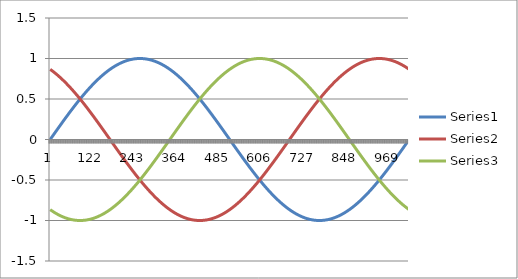
| Category | Series 0 | Series 1 | Series 2 |
|---|---|---|---|
| 0 | 0 | 0.866 | -0.866 |
| 1 | 0.006 | 0.863 | -0.869 |
| 2 | 0.012 | 0.86 | -0.872 |
| 3 | 0.018 | 0.857 | -0.875 |
| 4 | 0.025 | 0.853 | -0.878 |
| 5 | 0.031 | 0.85 | -0.881 |
| 6 | 0.037 | 0.847 | -0.884 |
| 7 | 0.043 | 0.844 | -0.887 |
| 8 | 0.049 | 0.84 | -0.889 |
| 9 | 0.055 | 0.837 | -0.892 |
| 10 | 0.061 | 0.834 | -0.895 |
| 11 | 0.067 | 0.83 | -0.898 |
| 12 | 0.074 | 0.827 | -0.9 |
| 13 | 0.08 | 0.823 | -0.903 |
| 14 | 0.086 | 0.82 | -0.906 |
| 15 | 0.092 | 0.816 | -0.908 |
| 16 | 0.098 | 0.813 | -0.911 |
| 17 | 0.104 | 0.809 | -0.913 |
| 18 | 0.11 | 0.806 | -0.916 |
| 19 | 0.116 | 0.802 | -0.918 |
| 20 | 0.122 | 0.798 | -0.921 |
| 21 | 0.128 | 0.795 | -0.923 |
| 22 | 0.135 | 0.791 | -0.925 |
| 23 | 0.141 | 0.787 | -0.928 |
| 24 | 0.147 | 0.783 | -0.93 |
| 25 | 0.153 | 0.779 | -0.932 |
| 26 | 0.159 | 0.776 | -0.934 |
| 27 | 0.165 | 0.772 | -0.937 |
| 28 | 0.171 | 0.768 | -0.939 |
| 29 | 0.177 | 0.764 | -0.941 |
| 30 | 0.183 | 0.76 | -0.943 |
| 31 | 0.189 | 0.756 | -0.945 |
| 32 | 0.195 | 0.752 | -0.947 |
| 33 | 0.201 | 0.748 | -0.949 |
| 34 | 0.207 | 0.744 | -0.951 |
| 35 | 0.213 | 0.74 | -0.953 |
| 36 | 0.219 | 0.735 | -0.955 |
| 37 | 0.225 | 0.731 | -0.956 |
| 38 | 0.231 | 0.727 | -0.958 |
| 39 | 0.237 | 0.723 | -0.96 |
| 40 | 0.243 | 0.719 | -0.962 |
| 41 | 0.249 | 0.714 | -0.963 |
| 42 | 0.255 | 0.71 | -0.965 |
| 43 | 0.261 | 0.706 | -0.966 |
| 44 | 0.267 | 0.701 | -0.968 |
| 45 | 0.273 | 0.697 | -0.97 |
| 46 | 0.279 | 0.692 | -0.971 |
| 47 | 0.284 | 0.688 | -0.972 |
| 48 | 0.29 | 0.684 | -0.974 |
| 49 | 0.296 | 0.679 | -0.975 |
| 50 | 0.302 | 0.675 | -0.977 |
| 51 | 0.308 | 0.67 | -0.978 |
| 52 | 0.314 | 0.665 | -0.979 |
| 53 | 0.319 | 0.661 | -0.98 |
| 54 | 0.325 | 0.656 | -0.982 |
| 55 | 0.331 | 0.652 | -0.983 |
| 56 | 0.337 | 0.647 | -0.984 |
| 57 | 0.343 | 0.642 | -0.985 |
| 58 | 0.348 | 0.638 | -0.986 |
| 59 | 0.354 | 0.633 | -0.987 |
| 60 | 0.36 | 0.628 | -0.988 |
| 61 | 0.366 | 0.623 | -0.989 |
| 62 | 0.371 | 0.618 | -0.99 |
| 63 | 0.377 | 0.614 | -0.991 |
| 64 | 0.383 | 0.609 | -0.991 |
| 65 | 0.388 | 0.604 | -0.992 |
| 66 | 0.394 | 0.599 | -0.993 |
| 67 | 0.4 | 0.594 | -0.994 |
| 68 | 0.405 | 0.589 | -0.994 |
| 69 | 0.411 | 0.584 | -0.995 |
| 70 | 0.416 | 0.579 | -0.996 |
| 71 | 0.422 | 0.574 | -0.996 |
| 72 | 0.428 | 0.569 | -0.997 |
| 73 | 0.433 | 0.564 | -0.997 |
| 74 | 0.439 | 0.559 | -0.998 |
| 75 | 0.444 | 0.554 | -0.998 |
| 76 | 0.45 | 0.549 | -0.998 |
| 77 | 0.455 | 0.544 | -0.999 |
| 78 | 0.461 | 0.538 | -0.999 |
| 79 | 0.466 | 0.533 | -0.999 |
| 80 | 0.471 | 0.528 | -0.999 |
| 81 | 0.477 | 0.523 | -1 |
| 82 | 0.482 | 0.518 | -1 |
| 83 | 0.488 | 0.512 | -1 |
| 84 | 0.493 | 0.507 | -1 |
| 85 | 0.498 | 0.502 | -1 |
| 86 | 0.504 | 0.496 | -1 |
| 87 | 0.509 | 0.491 | -1 |
| 88 | 0.514 | 0.486 | -1 |
| 89 | 0.519 | 0.48 | -1 |
| 90 | 0.525 | 0.475 | -1 |
| 91 | 0.53 | 0.47 | -0.999 |
| 92 | 0.535 | 0.464 | -0.999 |
| 93 | 0.54 | 0.459 | -0.999 |
| 94 | 0.545 | 0.453 | -0.999 |
| 95 | 0.55 | 0.448 | -0.998 |
| 96 | 0.556 | 0.442 | -0.998 |
| 97 | 0.561 | 0.437 | -0.997 |
| 98 | 0.566 | 0.431 | -0.997 |
| 99 | 0.571 | 0.426 | -0.996 |
| 100 | 0.576 | 0.42 | -0.996 |
| 101 | 0.581 | 0.415 | -0.995 |
| 102 | 0.586 | 0.409 | -0.995 |
| 103 | 0.591 | 0.403 | -0.994 |
| 104 | 0.596 | 0.398 | -0.993 |
| 105 | 0.601 | 0.392 | -0.993 |
| 106 | 0.605 | 0.386 | -0.992 |
| 107 | 0.61 | 0.381 | -0.991 |
| 108 | 0.615 | 0.375 | -0.99 |
| 109 | 0.62 | 0.369 | -0.989 |
| 110 | 0.625 | 0.364 | -0.989 |
| 111 | 0.63 | 0.358 | -0.988 |
| 112 | 0.634 | 0.352 | -0.987 |
| 113 | 0.639 | 0.346 | -0.986 |
| 114 | 0.644 | 0.341 | -0.985 |
| 115 | 0.648 | 0.335 | -0.983 |
| 116 | 0.653 | 0.329 | -0.982 |
| 117 | 0.658 | 0.323 | -0.981 |
| 118 | 0.662 | 0.318 | -0.98 |
| 119 | 0.667 | 0.312 | -0.979 |
| 120 | 0.672 | 0.306 | -0.977 |
| 121 | 0.676 | 0.3 | -0.976 |
| 122 | 0.681 | 0.294 | -0.975 |
| 123 | 0.685 | 0.288 | -0.973 |
| 124 | 0.69 | 0.282 | -0.972 |
| 125 | 0.694 | 0.277 | -0.97 |
| 126 | 0.698 | 0.271 | -0.969 |
| 127 | 0.703 | 0.265 | -0.967 |
| 128 | 0.707 | 0.259 | -0.966 |
| 129 | 0.711 | 0.253 | -0.964 |
| 130 | 0.716 | 0.247 | -0.963 |
| 131 | 0.72 | 0.241 | -0.961 |
| 132 | 0.724 | 0.235 | -0.959 |
| 133 | 0.728 | 0.229 | -0.958 |
| 134 | 0.733 | 0.223 | -0.956 |
| 135 | 0.737 | 0.217 | -0.954 |
| 136 | 0.741 | 0.211 | -0.952 |
| 137 | 0.745 | 0.205 | -0.95 |
| 138 | 0.749 | 0.199 | -0.948 |
| 139 | 0.753 | 0.193 | -0.946 |
| 140 | 0.757 | 0.187 | -0.944 |
| 141 | 0.761 | 0.181 | -0.942 |
| 142 | 0.765 | 0.175 | -0.94 |
| 143 | 0.769 | 0.169 | -0.938 |
| 144 | 0.773 | 0.163 | -0.936 |
| 145 | 0.777 | 0.157 | -0.934 |
| 146 | 0.781 | 0.151 | -0.931 |
| 147 | 0.785 | 0.145 | -0.929 |
| 148 | 0.788 | 0.139 | -0.927 |
| 149 | 0.792 | 0.133 | -0.925 |
| 150 | 0.796 | 0.126 | -0.922 |
| 151 | 0.8 | 0.12 | -0.92 |
| 152 | 0.803 | 0.114 | -0.917 |
| 153 | 0.807 | 0.108 | -0.915 |
| 154 | 0.81 | 0.102 | -0.913 |
| 155 | 0.814 | 0.096 | -0.91 |
| 156 | 0.818 | 0.09 | -0.907 |
| 157 | 0.821 | 0.084 | -0.905 |
| 158 | 0.825 | 0.078 | -0.902 |
| 159 | 0.828 | 0.072 | -0.9 |
| 160 | 0.831 | 0.065 | -0.897 |
| 161 | 0.835 | 0.059 | -0.894 |
| 162 | 0.838 | 0.053 | -0.891 |
| 163 | 0.842 | 0.047 | -0.889 |
| 164 | 0.845 | 0.041 | -0.886 |
| 165 | 0.848 | 0.035 | -0.883 |
| 166 | 0.851 | 0.029 | -0.88 |
| 167 | 0.855 | 0.022 | -0.877 |
| 168 | 0.858 | 0.016 | -0.874 |
| 169 | 0.861 | 0.01 | -0.871 |
| 170 | 0.864 | 0.004 | -0.868 |
| 171 | 0.867 | -0.002 | -0.865 |
| 172 | 0.87 | -0.008 | -0.862 |
| 173 | 0.873 | -0.014 | -0.859 |
| 174 | 0.876 | -0.02 | -0.856 |
| 175 | 0.879 | -0.027 | -0.852 |
| 176 | 0.882 | -0.033 | -0.849 |
| 177 | 0.885 | -0.039 | -0.846 |
| 178 | 0.888 | -0.045 | -0.843 |
| 179 | 0.89 | -0.051 | -0.839 |
| 180 | 0.893 | -0.057 | -0.836 |
| 181 | 0.896 | -0.063 | -0.833 |
| 182 | 0.899 | -0.069 | -0.829 |
| 183 | 0.901 | -0.076 | -0.826 |
| 184 | 0.904 | -0.082 | -0.822 |
| 185 | 0.907 | -0.088 | -0.819 |
| 186 | 0.909 | -0.094 | -0.815 |
| 187 | 0.912 | -0.1 | -0.812 |
| 188 | 0.914 | -0.106 | -0.808 |
| 189 | 0.917 | -0.112 | -0.804 |
| 190 | 0.919 | -0.118 | -0.801 |
| 191 | 0.921 | -0.124 | -0.797 |
| 192 | 0.924 | -0.131 | -0.793 |
| 193 | 0.926 | -0.137 | -0.79 |
| 194 | 0.928 | -0.143 | -0.786 |
| 195 | 0.931 | -0.149 | -0.782 |
| 196 | 0.933 | -0.155 | -0.778 |
| 197 | 0.935 | -0.161 | -0.774 |
| 198 | 0.937 | -0.167 | -0.77 |
| 199 | 0.939 | -0.173 | -0.766 |
| 200 | 0.942 | -0.179 | -0.763 |
| 201 | 0.944 | -0.185 | -0.759 |
| 202 | 0.946 | -0.191 | -0.755 |
| 203 | 0.948 | -0.197 | -0.75 |
| 204 | 0.95 | -0.203 | -0.746 |
| 205 | 0.951 | -0.209 | -0.742 |
| 206 | 0.953 | -0.215 | -0.738 |
| 207 | 0.955 | -0.221 | -0.734 |
| 208 | 0.957 | -0.227 | -0.73 |
| 209 | 0.959 | -0.233 | -0.726 |
| 210 | 0.96 | -0.239 | -0.721 |
| 211 | 0.962 | -0.245 | -0.717 |
| 212 | 0.964 | -0.251 | -0.713 |
| 213 | 0.965 | -0.257 | -0.709 |
| 214 | 0.967 | -0.263 | -0.704 |
| 215 | 0.968 | -0.269 | -0.7 |
| 216 | 0.97 | -0.275 | -0.695 |
| 217 | 0.971 | -0.28 | -0.691 |
| 218 | 0.973 | -0.286 | -0.687 |
| 219 | 0.974 | -0.292 | -0.682 |
| 220 | 0.976 | -0.298 | -0.678 |
| 221 | 0.977 | -0.304 | -0.673 |
| 222 | 0.978 | -0.31 | -0.669 |
| 223 | 0.98 | -0.316 | -0.664 |
| 224 | 0.981 | -0.321 | -0.659 |
| 225 | 0.982 | -0.327 | -0.655 |
| 226 | 0.983 | -0.333 | -0.65 |
| 227 | 0.984 | -0.339 | -0.645 |
| 228 | 0.985 | -0.345 | -0.641 |
| 229 | 0.986 | -0.35 | -0.636 |
| 230 | 0.987 | -0.356 | -0.631 |
| 231 | 0.988 | -0.362 | -0.626 |
| 232 | 0.989 | -0.368 | -0.622 |
| 233 | 0.99 | -0.373 | -0.617 |
| 234 | 0.991 | -0.379 | -0.612 |
| 235 | 0.992 | -0.385 | -0.607 |
| 236 | 0.992 | -0.39 | -0.602 |
| 237 | 0.993 | -0.396 | -0.597 |
| 238 | 0.994 | -0.401 | -0.592 |
| 239 | 0.995 | -0.407 | -0.587 |
| 240 | 0.995 | -0.413 | -0.582 |
| 241 | 0.996 | -0.418 | -0.577 |
| 242 | 0.996 | -0.424 | -0.572 |
| 243 | 0.997 | -0.429 | -0.567 |
| 244 | 0.997 | -0.435 | -0.562 |
| 245 | 0.998 | -0.44 | -0.557 |
| 246 | 0.998 | -0.446 | -0.552 |
| 247 | 0.998 | -0.451 | -0.547 |
| 248 | 0.999 | -0.457 | -0.542 |
| 249 | 0.999 | -0.462 | -0.537 |
| 250 | 0.999 | -0.468 | -0.532 |
| 251 | 1 | -0.473 | -0.526 |
| 252 | 1 | -0.479 | -0.521 |
| 253 | 1 | -0.484 | -0.516 |
| 254 | 1 | -0.489 | -0.511 |
| 255 | 1 | -0.495 | -0.505 |
| 256 | 1 | -0.5 | -0.5 |
| 257 | 1 | -0.505 | -0.495 |
| 258 | 1 | -0.511 | -0.489 |
| 259 | 1 | -0.516 | -0.484 |
| 260 | 1 | -0.521 | -0.479 |
| 261 | 1 | -0.526 | -0.473 |
| 262 | 0.999 | -0.532 | -0.468 |
| 263 | 0.999 | -0.537 | -0.462 |
| 264 | 0.999 | -0.542 | -0.457 |
| 265 | 0.998 | -0.547 | -0.451 |
| 266 | 0.998 | -0.552 | -0.446 |
| 267 | 0.998 | -0.557 | -0.44 |
| 268 | 0.997 | -0.562 | -0.435 |
| 269 | 0.997 | -0.567 | -0.429 |
| 270 | 0.996 | -0.572 | -0.424 |
| 271 | 0.996 | -0.577 | -0.418 |
| 272 | 0.995 | -0.582 | -0.413 |
| 273 | 0.995 | -0.587 | -0.407 |
| 274 | 0.994 | -0.592 | -0.401 |
| 275 | 0.993 | -0.597 | -0.396 |
| 276 | 0.992 | -0.602 | -0.39 |
| 277 | 0.992 | -0.607 | -0.385 |
| 278 | 0.991 | -0.612 | -0.379 |
| 279 | 0.99 | -0.617 | -0.373 |
| 280 | 0.989 | -0.622 | -0.368 |
| 281 | 0.988 | -0.626 | -0.362 |
| 282 | 0.987 | -0.631 | -0.356 |
| 283 | 0.986 | -0.636 | -0.35 |
| 284 | 0.985 | -0.641 | -0.345 |
| 285 | 0.984 | -0.645 | -0.339 |
| 286 | 0.983 | -0.65 | -0.333 |
| 287 | 0.982 | -0.655 | -0.327 |
| 288 | 0.981 | -0.659 | -0.321 |
| 289 | 0.98 | -0.664 | -0.316 |
| 290 | 0.978 | -0.669 | -0.31 |
| 291 | 0.977 | -0.673 | -0.304 |
| 292 | 0.976 | -0.678 | -0.298 |
| 293 | 0.974 | -0.682 | -0.292 |
| 294 | 0.973 | -0.687 | -0.286 |
| 295 | 0.971 | -0.691 | -0.28 |
| 296 | 0.97 | -0.695 | -0.275 |
| 297 | 0.968 | -0.7 | -0.269 |
| 298 | 0.967 | -0.704 | -0.263 |
| 299 | 0.965 | -0.709 | -0.257 |
| 300 | 0.964 | -0.713 | -0.251 |
| 301 | 0.962 | -0.717 | -0.245 |
| 302 | 0.96 | -0.721 | -0.239 |
| 303 | 0.959 | -0.726 | -0.233 |
| 304 | 0.957 | -0.73 | -0.227 |
| 305 | 0.955 | -0.734 | -0.221 |
| 306 | 0.953 | -0.738 | -0.215 |
| 307 | 0.951 | -0.742 | -0.209 |
| 308 | 0.95 | -0.746 | -0.203 |
| 309 | 0.948 | -0.75 | -0.197 |
| 310 | 0.946 | -0.755 | -0.191 |
| 311 | 0.944 | -0.759 | -0.185 |
| 312 | 0.942 | -0.763 | -0.179 |
| 313 | 0.939 | -0.766 | -0.173 |
| 314 | 0.937 | -0.77 | -0.167 |
| 315 | 0.935 | -0.774 | -0.161 |
| 316 | 0.933 | -0.778 | -0.155 |
| 317 | 0.931 | -0.782 | -0.149 |
| 318 | 0.928 | -0.786 | -0.143 |
| 319 | 0.926 | -0.79 | -0.137 |
| 320 | 0.924 | -0.793 | -0.131 |
| 321 | 0.921 | -0.797 | -0.124 |
| 322 | 0.919 | -0.801 | -0.118 |
| 323 | 0.917 | -0.804 | -0.112 |
| 324 | 0.914 | -0.808 | -0.106 |
| 325 | 0.912 | -0.812 | -0.1 |
| 326 | 0.909 | -0.815 | -0.094 |
| 327 | 0.907 | -0.819 | -0.088 |
| 328 | 0.904 | -0.822 | -0.082 |
| 329 | 0.901 | -0.826 | -0.076 |
| 330 | 0.899 | -0.829 | -0.069 |
| 331 | 0.896 | -0.833 | -0.063 |
| 332 | 0.893 | -0.836 | -0.057 |
| 333 | 0.89 | -0.839 | -0.051 |
| 334 | 0.888 | -0.843 | -0.045 |
| 335 | 0.885 | -0.846 | -0.039 |
| 336 | 0.882 | -0.849 | -0.033 |
| 337 | 0.879 | -0.852 | -0.027 |
| 338 | 0.876 | -0.856 | -0.02 |
| 339 | 0.873 | -0.859 | -0.014 |
| 340 | 0.87 | -0.862 | -0.008 |
| 341 | 0.867 | -0.865 | -0.002 |
| 342 | 0.864 | -0.868 | 0.004 |
| 343 | 0.861 | -0.871 | 0.01 |
| 344 | 0.858 | -0.874 | 0.016 |
| 345 | 0.855 | -0.877 | 0.022 |
| 346 | 0.851 | -0.88 | 0.029 |
| 347 | 0.848 | -0.883 | 0.035 |
| 348 | 0.845 | -0.886 | 0.041 |
| 349 | 0.842 | -0.889 | 0.047 |
| 350 | 0.838 | -0.891 | 0.053 |
| 351 | 0.835 | -0.894 | 0.059 |
| 352 | 0.831 | -0.897 | 0.065 |
| 353 | 0.828 | -0.9 | 0.072 |
| 354 | 0.825 | -0.902 | 0.078 |
| 355 | 0.821 | -0.905 | 0.084 |
| 356 | 0.818 | -0.907 | 0.09 |
| 357 | 0.814 | -0.91 | 0.096 |
| 358 | 0.81 | -0.913 | 0.102 |
| 359 | 0.807 | -0.915 | 0.108 |
| 360 | 0.803 | -0.917 | 0.114 |
| 361 | 0.8 | -0.92 | 0.12 |
| 362 | 0.796 | -0.922 | 0.126 |
| 363 | 0.792 | -0.925 | 0.133 |
| 364 | 0.788 | -0.927 | 0.139 |
| 365 | 0.785 | -0.929 | 0.145 |
| 366 | 0.781 | -0.931 | 0.151 |
| 367 | 0.777 | -0.934 | 0.157 |
| 368 | 0.773 | -0.936 | 0.163 |
| 369 | 0.769 | -0.938 | 0.169 |
| 370 | 0.765 | -0.94 | 0.175 |
| 371 | 0.761 | -0.942 | 0.181 |
| 372 | 0.757 | -0.944 | 0.187 |
| 373 | 0.753 | -0.946 | 0.193 |
| 374 | 0.749 | -0.948 | 0.199 |
| 375 | 0.745 | -0.95 | 0.205 |
| 376 | 0.741 | -0.952 | 0.211 |
| 377 | 0.737 | -0.954 | 0.217 |
| 378 | 0.733 | -0.956 | 0.223 |
| 379 | 0.728 | -0.958 | 0.229 |
| 380 | 0.724 | -0.959 | 0.235 |
| 381 | 0.72 | -0.961 | 0.241 |
| 382 | 0.716 | -0.963 | 0.247 |
| 383 | 0.711 | -0.964 | 0.253 |
| 384 | 0.707 | -0.966 | 0.259 |
| 385 | 0.703 | -0.967 | 0.265 |
| 386 | 0.698 | -0.969 | 0.271 |
| 387 | 0.694 | -0.97 | 0.277 |
| 388 | 0.69 | -0.972 | 0.282 |
| 389 | 0.685 | -0.973 | 0.288 |
| 390 | 0.681 | -0.975 | 0.294 |
| 391 | 0.676 | -0.976 | 0.3 |
| 392 | 0.672 | -0.977 | 0.306 |
| 393 | 0.667 | -0.979 | 0.312 |
| 394 | 0.662 | -0.98 | 0.318 |
| 395 | 0.658 | -0.981 | 0.323 |
| 396 | 0.653 | -0.982 | 0.329 |
| 397 | 0.648 | -0.983 | 0.335 |
| 398 | 0.644 | -0.985 | 0.341 |
| 399 | 0.639 | -0.986 | 0.346 |
| 400 | 0.634 | -0.987 | 0.352 |
| 401 | 0.63 | -0.988 | 0.358 |
| 402 | 0.625 | -0.989 | 0.364 |
| 403 | 0.62 | -0.989 | 0.369 |
| 404 | 0.615 | -0.99 | 0.375 |
| 405 | 0.61 | -0.991 | 0.381 |
| 406 | 0.605 | -0.992 | 0.386 |
| 407 | 0.601 | -0.993 | 0.392 |
| 408 | 0.596 | -0.993 | 0.398 |
| 409 | 0.591 | -0.994 | 0.403 |
| 410 | 0.586 | -0.995 | 0.409 |
| 411 | 0.581 | -0.995 | 0.415 |
| 412 | 0.576 | -0.996 | 0.42 |
| 413 | 0.571 | -0.996 | 0.426 |
| 414 | 0.566 | -0.997 | 0.431 |
| 415 | 0.561 | -0.997 | 0.437 |
| 416 | 0.556 | -0.998 | 0.442 |
| 417 | 0.55 | -0.998 | 0.448 |
| 418 | 0.545 | -0.999 | 0.453 |
| 419 | 0.54 | -0.999 | 0.459 |
| 420 | 0.535 | -0.999 | 0.464 |
| 421 | 0.53 | -0.999 | 0.47 |
| 422 | 0.525 | -1 | 0.475 |
| 423 | 0.519 | -1 | 0.48 |
| 424 | 0.514 | -1 | 0.486 |
| 425 | 0.509 | -1 | 0.491 |
| 426 | 0.504 | -1 | 0.496 |
| 427 | 0.498 | -1 | 0.502 |
| 428 | 0.493 | -1 | 0.507 |
| 429 | 0.488 | -1 | 0.512 |
| 430 | 0.482 | -1 | 0.518 |
| 431 | 0.477 | -1 | 0.523 |
| 432 | 0.471 | -0.999 | 0.528 |
| 433 | 0.466 | -0.999 | 0.533 |
| 434 | 0.461 | -0.999 | 0.538 |
| 435 | 0.455 | -0.999 | 0.544 |
| 436 | 0.45 | -0.998 | 0.549 |
| 437 | 0.444 | -0.998 | 0.554 |
| 438 | 0.439 | -0.998 | 0.559 |
| 439 | 0.433 | -0.997 | 0.564 |
| 440 | 0.428 | -0.997 | 0.569 |
| 441 | 0.422 | -0.996 | 0.574 |
| 442 | 0.416 | -0.996 | 0.579 |
| 443 | 0.411 | -0.995 | 0.584 |
| 444 | 0.405 | -0.994 | 0.589 |
| 445 | 0.4 | -0.994 | 0.594 |
| 446 | 0.394 | -0.993 | 0.599 |
| 447 | 0.388 | -0.992 | 0.604 |
| 448 | 0.383 | -0.991 | 0.609 |
| 449 | 0.377 | -0.991 | 0.614 |
| 450 | 0.371 | -0.99 | 0.618 |
| 451 | 0.366 | -0.989 | 0.623 |
| 452 | 0.36 | -0.988 | 0.628 |
| 453 | 0.354 | -0.987 | 0.633 |
| 454 | 0.348 | -0.986 | 0.638 |
| 455 | 0.343 | -0.985 | 0.642 |
| 456 | 0.337 | -0.984 | 0.647 |
| 457 | 0.331 | -0.983 | 0.652 |
| 458 | 0.325 | -0.982 | 0.656 |
| 459 | 0.319 | -0.98 | 0.661 |
| 460 | 0.314 | -0.979 | 0.665 |
| 461 | 0.308 | -0.978 | 0.67 |
| 462 | 0.302 | -0.977 | 0.675 |
| 463 | 0.296 | -0.975 | 0.679 |
| 464 | 0.29 | -0.974 | 0.684 |
| 465 | 0.284 | -0.972 | 0.688 |
| 466 | 0.279 | -0.971 | 0.692 |
| 467 | 0.273 | -0.97 | 0.697 |
| 468 | 0.267 | -0.968 | 0.701 |
| 469 | 0.261 | -0.966 | 0.706 |
| 470 | 0.255 | -0.965 | 0.71 |
| 471 | 0.249 | -0.963 | 0.714 |
| 472 | 0.243 | -0.962 | 0.719 |
| 473 | 0.237 | -0.96 | 0.723 |
| 474 | 0.231 | -0.958 | 0.727 |
| 475 | 0.225 | -0.956 | 0.731 |
| 476 | 0.219 | -0.955 | 0.735 |
| 477 | 0.213 | -0.953 | 0.74 |
| 478 | 0.207 | -0.951 | 0.744 |
| 479 | 0.201 | -0.949 | 0.748 |
| 480 | 0.195 | -0.947 | 0.752 |
| 481 | 0.189 | -0.945 | 0.756 |
| 482 | 0.183 | -0.943 | 0.76 |
| 483 | 0.177 | -0.941 | 0.764 |
| 484 | 0.171 | -0.939 | 0.768 |
| 485 | 0.165 | -0.937 | 0.772 |
| 486 | 0.159 | -0.934 | 0.776 |
| 487 | 0.153 | -0.932 | 0.779 |
| 488 | 0.147 | -0.93 | 0.783 |
| 489 | 0.141 | -0.928 | 0.787 |
| 490 | 0.135 | -0.925 | 0.791 |
| 491 | 0.128 | -0.923 | 0.795 |
| 492 | 0.122 | -0.921 | 0.798 |
| 493 | 0.116 | -0.918 | 0.802 |
| 494 | 0.11 | -0.916 | 0.806 |
| 495 | 0.104 | -0.913 | 0.809 |
| 496 | 0.098 | -0.911 | 0.813 |
| 497 | 0.092 | -0.908 | 0.816 |
| 498 | 0.086 | -0.906 | 0.82 |
| 499 | 0.08 | -0.903 | 0.823 |
| 500 | 0.074 | -0.9 | 0.827 |
| 501 | 0.067 | -0.898 | 0.83 |
| 502 | 0.061 | -0.895 | 0.834 |
| 503 | 0.055 | -0.892 | 0.837 |
| 504 | 0.049 | -0.889 | 0.84 |
| 505 | 0.043 | -0.887 | 0.844 |
| 506 | 0.037 | -0.884 | 0.847 |
| 507 | 0.031 | -0.881 | 0.85 |
| 508 | 0.025 | -0.878 | 0.853 |
| 509 | 0.018 | -0.875 | 0.857 |
| 510 | 0.012 | -0.872 | 0.86 |
| 511 | 0.006 | -0.869 | 0.863 |
| 512 | 0 | -0.866 | 0.866 |
| 513 | -0.006 | -0.863 | 0.869 |
| 514 | -0.012 | -0.86 | 0.872 |
| 515 | -0.018 | -0.857 | 0.875 |
| 516 | -0.025 | -0.853 | 0.878 |
| 517 | -0.031 | -0.85 | 0.881 |
| 518 | -0.037 | -0.847 | 0.884 |
| 519 | -0.043 | -0.844 | 0.887 |
| 520 | -0.049 | -0.84 | 0.889 |
| 521 | -0.055 | -0.837 | 0.892 |
| 522 | -0.061 | -0.834 | 0.895 |
| 523 | -0.067 | -0.83 | 0.898 |
| 524 | -0.074 | -0.827 | 0.9 |
| 525 | -0.08 | -0.823 | 0.903 |
| 526 | -0.086 | -0.82 | 0.906 |
| 527 | -0.092 | -0.816 | 0.908 |
| 528 | -0.098 | -0.813 | 0.911 |
| 529 | -0.104 | -0.809 | 0.913 |
| 530 | -0.11 | -0.806 | 0.916 |
| 531 | -0.116 | -0.802 | 0.918 |
| 532 | -0.122 | -0.798 | 0.921 |
| 533 | -0.128 | -0.795 | 0.923 |
| 534 | -0.135 | -0.791 | 0.925 |
| 535 | -0.141 | -0.787 | 0.928 |
| 536 | -0.147 | -0.783 | 0.93 |
| 537 | -0.153 | -0.779 | 0.932 |
| 538 | -0.159 | -0.776 | 0.934 |
| 539 | -0.165 | -0.772 | 0.937 |
| 540 | -0.171 | -0.768 | 0.939 |
| 541 | -0.177 | -0.764 | 0.941 |
| 542 | -0.183 | -0.76 | 0.943 |
| 543 | -0.189 | -0.756 | 0.945 |
| 544 | -0.195 | -0.752 | 0.947 |
| 545 | -0.201 | -0.748 | 0.949 |
| 546 | -0.207 | -0.744 | 0.951 |
| 547 | -0.213 | -0.74 | 0.953 |
| 548 | -0.219 | -0.735 | 0.955 |
| 549 | -0.225 | -0.731 | 0.956 |
| 550 | -0.231 | -0.727 | 0.958 |
| 551 | -0.237 | -0.723 | 0.96 |
| 552 | -0.243 | -0.719 | 0.962 |
| 553 | -0.249 | -0.714 | 0.963 |
| 554 | -0.255 | -0.71 | 0.965 |
| 555 | -0.261 | -0.706 | 0.966 |
| 556 | -0.267 | -0.701 | 0.968 |
| 557 | -0.273 | -0.697 | 0.97 |
| 558 | -0.279 | -0.692 | 0.971 |
| 559 | -0.284 | -0.688 | 0.972 |
| 560 | -0.29 | -0.684 | 0.974 |
| 561 | -0.296 | -0.679 | 0.975 |
| 562 | -0.302 | -0.675 | 0.977 |
| 563 | -0.308 | -0.67 | 0.978 |
| 564 | -0.314 | -0.665 | 0.979 |
| 565 | -0.319 | -0.661 | 0.98 |
| 566 | -0.325 | -0.656 | 0.982 |
| 567 | -0.331 | -0.652 | 0.983 |
| 568 | -0.337 | -0.647 | 0.984 |
| 569 | -0.343 | -0.642 | 0.985 |
| 570 | -0.348 | -0.638 | 0.986 |
| 571 | -0.354 | -0.633 | 0.987 |
| 572 | -0.36 | -0.628 | 0.988 |
| 573 | -0.366 | -0.623 | 0.989 |
| 574 | -0.371 | -0.618 | 0.99 |
| 575 | -0.377 | -0.614 | 0.991 |
| 576 | -0.383 | -0.609 | 0.991 |
| 577 | -0.388 | -0.604 | 0.992 |
| 578 | -0.394 | -0.599 | 0.993 |
| 579 | -0.4 | -0.594 | 0.994 |
| 580 | -0.405 | -0.589 | 0.994 |
| 581 | -0.411 | -0.584 | 0.995 |
| 582 | -0.416 | -0.579 | 0.996 |
| 583 | -0.422 | -0.574 | 0.996 |
| 584 | -0.428 | -0.569 | 0.997 |
| 585 | -0.433 | -0.564 | 0.997 |
| 586 | -0.439 | -0.559 | 0.998 |
| 587 | -0.444 | -0.554 | 0.998 |
| 588 | -0.45 | -0.549 | 0.998 |
| 589 | -0.455 | -0.544 | 0.999 |
| 590 | -0.461 | -0.538 | 0.999 |
| 591 | -0.466 | -0.533 | 0.999 |
| 592 | -0.471 | -0.528 | 0.999 |
| 593 | -0.477 | -0.523 | 1 |
| 594 | -0.482 | -0.518 | 1 |
| 595 | -0.488 | -0.512 | 1 |
| 596 | -0.493 | -0.507 | 1 |
| 597 | -0.498 | -0.502 | 1 |
| 598 | -0.504 | -0.496 | 1 |
| 599 | -0.509 | -0.491 | 1 |
| 600 | -0.514 | -0.486 | 1 |
| 601 | -0.519 | -0.48 | 1 |
| 602 | -0.525 | -0.475 | 1 |
| 603 | -0.53 | -0.47 | 0.999 |
| 604 | -0.535 | -0.464 | 0.999 |
| 605 | -0.54 | -0.459 | 0.999 |
| 606 | -0.545 | -0.453 | 0.999 |
| 607 | -0.55 | -0.448 | 0.998 |
| 608 | -0.556 | -0.442 | 0.998 |
| 609 | -0.561 | -0.437 | 0.997 |
| 610 | -0.566 | -0.431 | 0.997 |
| 611 | -0.571 | -0.426 | 0.996 |
| 612 | -0.576 | -0.42 | 0.996 |
| 613 | -0.581 | -0.415 | 0.995 |
| 614 | -0.586 | -0.409 | 0.995 |
| 615 | -0.591 | -0.403 | 0.994 |
| 616 | -0.596 | -0.398 | 0.993 |
| 617 | -0.601 | -0.392 | 0.993 |
| 618 | -0.605 | -0.386 | 0.992 |
| 619 | -0.61 | -0.381 | 0.991 |
| 620 | -0.615 | -0.375 | 0.99 |
| 621 | -0.62 | -0.369 | 0.989 |
| 622 | -0.625 | -0.364 | 0.989 |
| 623 | -0.63 | -0.358 | 0.988 |
| 624 | -0.634 | -0.352 | 0.987 |
| 625 | -0.639 | -0.346 | 0.986 |
| 626 | -0.644 | -0.341 | 0.985 |
| 627 | -0.648 | -0.335 | 0.983 |
| 628 | -0.653 | -0.329 | 0.982 |
| 629 | -0.658 | -0.323 | 0.981 |
| 630 | -0.662 | -0.318 | 0.98 |
| 631 | -0.667 | -0.312 | 0.979 |
| 632 | -0.672 | -0.306 | 0.977 |
| 633 | -0.676 | -0.3 | 0.976 |
| 634 | -0.681 | -0.294 | 0.975 |
| 635 | -0.685 | -0.288 | 0.973 |
| 636 | -0.69 | -0.282 | 0.972 |
| 637 | -0.694 | -0.277 | 0.97 |
| 638 | -0.698 | -0.271 | 0.969 |
| 639 | -0.703 | -0.265 | 0.967 |
| 640 | -0.707 | -0.259 | 0.966 |
| 641 | -0.711 | -0.253 | 0.964 |
| 642 | -0.716 | -0.247 | 0.963 |
| 643 | -0.72 | -0.241 | 0.961 |
| 644 | -0.724 | -0.235 | 0.959 |
| 645 | -0.728 | -0.229 | 0.958 |
| 646 | -0.733 | -0.223 | 0.956 |
| 647 | -0.737 | -0.217 | 0.954 |
| 648 | -0.741 | -0.211 | 0.952 |
| 649 | -0.745 | -0.205 | 0.95 |
| 650 | -0.749 | -0.199 | 0.948 |
| 651 | -0.753 | -0.193 | 0.946 |
| 652 | -0.757 | -0.187 | 0.944 |
| 653 | -0.761 | -0.181 | 0.942 |
| 654 | -0.765 | -0.175 | 0.94 |
| 655 | -0.769 | -0.169 | 0.938 |
| 656 | -0.773 | -0.163 | 0.936 |
| 657 | -0.777 | -0.157 | 0.934 |
| 658 | -0.781 | -0.151 | 0.931 |
| 659 | -0.785 | -0.145 | 0.929 |
| 660 | -0.788 | -0.139 | 0.927 |
| 661 | -0.792 | -0.133 | 0.925 |
| 662 | -0.796 | -0.126 | 0.922 |
| 663 | -0.8 | -0.12 | 0.92 |
| 664 | -0.803 | -0.114 | 0.917 |
| 665 | -0.807 | -0.108 | 0.915 |
| 666 | -0.81 | -0.102 | 0.913 |
| 667 | -0.814 | -0.096 | 0.91 |
| 668 | -0.818 | -0.09 | 0.907 |
| 669 | -0.821 | -0.084 | 0.905 |
| 670 | -0.825 | -0.078 | 0.902 |
| 671 | -0.828 | -0.072 | 0.9 |
| 672 | -0.831 | -0.065 | 0.897 |
| 673 | -0.835 | -0.059 | 0.894 |
| 674 | -0.838 | -0.053 | 0.891 |
| 675 | -0.842 | -0.047 | 0.889 |
| 676 | -0.845 | -0.041 | 0.886 |
| 677 | -0.848 | -0.035 | 0.883 |
| 678 | -0.851 | -0.029 | 0.88 |
| 679 | -0.855 | -0.022 | 0.877 |
| 680 | -0.858 | -0.016 | 0.874 |
| 681 | -0.861 | -0.01 | 0.871 |
| 682 | -0.864 | -0.004 | 0.868 |
| 683 | -0.867 | 0.002 | 0.865 |
| 684 | -0.87 | 0.008 | 0.862 |
| 685 | -0.873 | 0.014 | 0.859 |
| 686 | -0.876 | 0.02 | 0.856 |
| 687 | -0.879 | 0.027 | 0.852 |
| 688 | -0.882 | 0.033 | 0.849 |
| 689 | -0.885 | 0.039 | 0.846 |
| 690 | -0.888 | 0.045 | 0.843 |
| 691 | -0.89 | 0.051 | 0.839 |
| 692 | -0.893 | 0.057 | 0.836 |
| 693 | -0.896 | 0.063 | 0.833 |
| 694 | -0.899 | 0.069 | 0.829 |
| 695 | -0.901 | 0.076 | 0.826 |
| 696 | -0.904 | 0.082 | 0.822 |
| 697 | -0.907 | 0.088 | 0.819 |
| 698 | -0.909 | 0.094 | 0.815 |
| 699 | -0.912 | 0.1 | 0.812 |
| 700 | -0.914 | 0.106 | 0.808 |
| 701 | -0.917 | 0.112 | 0.804 |
| 702 | -0.919 | 0.118 | 0.801 |
| 703 | -0.921 | 0.124 | 0.797 |
| 704 | -0.924 | 0.131 | 0.793 |
| 705 | -0.926 | 0.137 | 0.79 |
| 706 | -0.928 | 0.143 | 0.786 |
| 707 | -0.931 | 0.149 | 0.782 |
| 708 | -0.933 | 0.155 | 0.778 |
| 709 | -0.935 | 0.161 | 0.774 |
| 710 | -0.937 | 0.167 | 0.77 |
| 711 | -0.939 | 0.173 | 0.766 |
| 712 | -0.942 | 0.179 | 0.763 |
| 713 | -0.944 | 0.185 | 0.759 |
| 714 | -0.946 | 0.191 | 0.755 |
| 715 | -0.948 | 0.197 | 0.75 |
| 716 | -0.95 | 0.203 | 0.746 |
| 717 | -0.951 | 0.209 | 0.742 |
| 718 | -0.953 | 0.215 | 0.738 |
| 719 | -0.955 | 0.221 | 0.734 |
| 720 | -0.957 | 0.227 | 0.73 |
| 721 | -0.959 | 0.233 | 0.726 |
| 722 | -0.96 | 0.239 | 0.721 |
| 723 | -0.962 | 0.245 | 0.717 |
| 724 | -0.964 | 0.251 | 0.713 |
| 725 | -0.965 | 0.257 | 0.709 |
| 726 | -0.967 | 0.263 | 0.704 |
| 727 | -0.968 | 0.269 | 0.7 |
| 728 | -0.97 | 0.275 | 0.695 |
| 729 | -0.971 | 0.28 | 0.691 |
| 730 | -0.973 | 0.286 | 0.687 |
| 731 | -0.974 | 0.292 | 0.682 |
| 732 | -0.976 | 0.298 | 0.678 |
| 733 | -0.977 | 0.304 | 0.673 |
| 734 | -0.978 | 0.31 | 0.669 |
| 735 | -0.98 | 0.316 | 0.664 |
| 736 | -0.981 | 0.321 | 0.659 |
| 737 | -0.982 | 0.327 | 0.655 |
| 738 | -0.983 | 0.333 | 0.65 |
| 739 | -0.984 | 0.339 | 0.645 |
| 740 | -0.985 | 0.345 | 0.641 |
| 741 | -0.986 | 0.35 | 0.636 |
| 742 | -0.987 | 0.356 | 0.631 |
| 743 | -0.988 | 0.362 | 0.626 |
| 744 | -0.989 | 0.368 | 0.622 |
| 745 | -0.99 | 0.373 | 0.617 |
| 746 | -0.991 | 0.379 | 0.612 |
| 747 | -0.992 | 0.385 | 0.607 |
| 748 | -0.992 | 0.39 | 0.602 |
| 749 | -0.993 | 0.396 | 0.597 |
| 750 | -0.994 | 0.401 | 0.592 |
| 751 | -0.995 | 0.407 | 0.587 |
| 752 | -0.995 | 0.413 | 0.582 |
| 753 | -0.996 | 0.418 | 0.577 |
| 754 | -0.996 | 0.424 | 0.572 |
| 755 | -0.997 | 0.429 | 0.567 |
| 756 | -0.997 | 0.435 | 0.562 |
| 757 | -0.998 | 0.44 | 0.557 |
| 758 | -0.998 | 0.446 | 0.552 |
| 759 | -0.998 | 0.451 | 0.547 |
| 760 | -0.999 | 0.457 | 0.542 |
| 761 | -0.999 | 0.462 | 0.537 |
| 762 | -0.999 | 0.468 | 0.532 |
| 763 | -1 | 0.473 | 0.526 |
| 764 | -1 | 0.479 | 0.521 |
| 765 | -1 | 0.484 | 0.516 |
| 766 | -1 | 0.489 | 0.511 |
| 767 | -1 | 0.495 | 0.505 |
| 768 | -1 | 0.5 | 0.5 |
| 769 | -1 | 0.505 | 0.495 |
| 770 | -1 | 0.511 | 0.489 |
| 771 | -1 | 0.516 | 0.484 |
| 772 | -1 | 0.521 | 0.479 |
| 773 | -1 | 0.526 | 0.473 |
| 774 | -0.999 | 0.532 | 0.468 |
| 775 | -0.999 | 0.537 | 0.462 |
| 776 | -0.999 | 0.542 | 0.457 |
| 777 | -0.998 | 0.547 | 0.451 |
| 778 | -0.998 | 0.552 | 0.446 |
| 779 | -0.998 | 0.557 | 0.44 |
| 780 | -0.997 | 0.562 | 0.435 |
| 781 | -0.997 | 0.567 | 0.429 |
| 782 | -0.996 | 0.572 | 0.424 |
| 783 | -0.996 | 0.577 | 0.418 |
| 784 | -0.995 | 0.582 | 0.413 |
| 785 | -0.995 | 0.587 | 0.407 |
| 786 | -0.994 | 0.592 | 0.401 |
| 787 | -0.993 | 0.597 | 0.396 |
| 788 | -0.992 | 0.602 | 0.39 |
| 789 | -0.992 | 0.607 | 0.385 |
| 790 | -0.991 | 0.612 | 0.379 |
| 791 | -0.99 | 0.617 | 0.373 |
| 792 | -0.989 | 0.622 | 0.368 |
| 793 | -0.988 | 0.626 | 0.362 |
| 794 | -0.987 | 0.631 | 0.356 |
| 795 | -0.986 | 0.636 | 0.35 |
| 796 | -0.985 | 0.641 | 0.345 |
| 797 | -0.984 | 0.645 | 0.339 |
| 798 | -0.983 | 0.65 | 0.333 |
| 799 | -0.982 | 0.655 | 0.327 |
| 800 | -0.981 | 0.659 | 0.321 |
| 801 | -0.98 | 0.664 | 0.316 |
| 802 | -0.978 | 0.669 | 0.31 |
| 803 | -0.977 | 0.673 | 0.304 |
| 804 | -0.976 | 0.678 | 0.298 |
| 805 | -0.974 | 0.682 | 0.292 |
| 806 | -0.973 | 0.687 | 0.286 |
| 807 | -0.971 | 0.691 | 0.28 |
| 808 | -0.97 | 0.695 | 0.275 |
| 809 | -0.968 | 0.7 | 0.269 |
| 810 | -0.967 | 0.704 | 0.263 |
| 811 | -0.965 | 0.709 | 0.257 |
| 812 | -0.964 | 0.713 | 0.251 |
| 813 | -0.962 | 0.717 | 0.245 |
| 814 | -0.96 | 0.721 | 0.239 |
| 815 | -0.959 | 0.726 | 0.233 |
| 816 | -0.957 | 0.73 | 0.227 |
| 817 | -0.955 | 0.734 | 0.221 |
| 818 | -0.953 | 0.738 | 0.215 |
| 819 | -0.951 | 0.742 | 0.209 |
| 820 | -0.95 | 0.746 | 0.203 |
| 821 | -0.948 | 0.75 | 0.197 |
| 822 | -0.946 | 0.755 | 0.191 |
| 823 | -0.944 | 0.759 | 0.185 |
| 824 | -0.942 | 0.763 | 0.179 |
| 825 | -0.939 | 0.766 | 0.173 |
| 826 | -0.937 | 0.77 | 0.167 |
| 827 | -0.935 | 0.774 | 0.161 |
| 828 | -0.933 | 0.778 | 0.155 |
| 829 | -0.931 | 0.782 | 0.149 |
| 830 | -0.928 | 0.786 | 0.143 |
| 831 | -0.926 | 0.79 | 0.137 |
| 832 | -0.924 | 0.793 | 0.131 |
| 833 | -0.921 | 0.797 | 0.124 |
| 834 | -0.919 | 0.801 | 0.118 |
| 835 | -0.917 | 0.804 | 0.112 |
| 836 | -0.914 | 0.808 | 0.106 |
| 837 | -0.912 | 0.812 | 0.1 |
| 838 | -0.909 | 0.815 | 0.094 |
| 839 | -0.907 | 0.819 | 0.088 |
| 840 | -0.904 | 0.822 | 0.082 |
| 841 | -0.901 | 0.826 | 0.076 |
| 842 | -0.899 | 0.829 | 0.069 |
| 843 | -0.896 | 0.833 | 0.063 |
| 844 | -0.893 | 0.836 | 0.057 |
| 845 | -0.89 | 0.839 | 0.051 |
| 846 | -0.888 | 0.843 | 0.045 |
| 847 | -0.885 | 0.846 | 0.039 |
| 848 | -0.882 | 0.849 | 0.033 |
| 849 | -0.879 | 0.852 | 0.027 |
| 850 | -0.876 | 0.856 | 0.02 |
| 851 | -0.873 | 0.859 | 0.014 |
| 852 | -0.87 | 0.862 | 0.008 |
| 853 | -0.867 | 0.865 | 0.002 |
| 854 | -0.864 | 0.868 | -0.004 |
| 855 | -0.861 | 0.871 | -0.01 |
| 856 | -0.858 | 0.874 | -0.016 |
| 857 | -0.855 | 0.877 | -0.022 |
| 858 | -0.851 | 0.88 | -0.029 |
| 859 | -0.848 | 0.883 | -0.035 |
| 860 | -0.845 | 0.886 | -0.041 |
| 861 | -0.842 | 0.889 | -0.047 |
| 862 | -0.838 | 0.891 | -0.053 |
| 863 | -0.835 | 0.894 | -0.059 |
| 864 | -0.831 | 0.897 | -0.065 |
| 865 | -0.828 | 0.9 | -0.072 |
| 866 | -0.825 | 0.902 | -0.078 |
| 867 | -0.821 | 0.905 | -0.084 |
| 868 | -0.818 | 0.907 | -0.09 |
| 869 | -0.814 | 0.91 | -0.096 |
| 870 | -0.81 | 0.913 | -0.102 |
| 871 | -0.807 | 0.915 | -0.108 |
| 872 | -0.803 | 0.917 | -0.114 |
| 873 | -0.8 | 0.92 | -0.12 |
| 874 | -0.796 | 0.922 | -0.126 |
| 875 | -0.792 | 0.925 | -0.133 |
| 876 | -0.788 | 0.927 | -0.139 |
| 877 | -0.785 | 0.929 | -0.145 |
| 878 | -0.781 | 0.931 | -0.151 |
| 879 | -0.777 | 0.934 | -0.157 |
| 880 | -0.773 | 0.936 | -0.163 |
| 881 | -0.769 | 0.938 | -0.169 |
| 882 | -0.765 | 0.94 | -0.175 |
| 883 | -0.761 | 0.942 | -0.181 |
| 884 | -0.757 | 0.944 | -0.187 |
| 885 | -0.753 | 0.946 | -0.193 |
| 886 | -0.749 | 0.948 | -0.199 |
| 887 | -0.745 | 0.95 | -0.205 |
| 888 | -0.741 | 0.952 | -0.211 |
| 889 | -0.737 | 0.954 | -0.217 |
| 890 | -0.733 | 0.956 | -0.223 |
| 891 | -0.728 | 0.958 | -0.229 |
| 892 | -0.724 | 0.959 | -0.235 |
| 893 | -0.72 | 0.961 | -0.241 |
| 894 | -0.716 | 0.963 | -0.247 |
| 895 | -0.711 | 0.964 | -0.253 |
| 896 | -0.707 | 0.966 | -0.259 |
| 897 | -0.703 | 0.967 | -0.265 |
| 898 | -0.698 | 0.969 | -0.271 |
| 899 | -0.694 | 0.97 | -0.277 |
| 900 | -0.69 | 0.972 | -0.282 |
| 901 | -0.685 | 0.973 | -0.288 |
| 902 | -0.681 | 0.975 | -0.294 |
| 903 | -0.676 | 0.976 | -0.3 |
| 904 | -0.672 | 0.977 | -0.306 |
| 905 | -0.667 | 0.979 | -0.312 |
| 906 | -0.662 | 0.98 | -0.318 |
| 907 | -0.658 | 0.981 | -0.323 |
| 908 | -0.653 | 0.982 | -0.329 |
| 909 | -0.648 | 0.983 | -0.335 |
| 910 | -0.644 | 0.985 | -0.341 |
| 911 | -0.639 | 0.986 | -0.346 |
| 912 | -0.634 | 0.987 | -0.352 |
| 913 | -0.63 | 0.988 | -0.358 |
| 914 | -0.625 | 0.989 | -0.364 |
| 915 | -0.62 | 0.989 | -0.369 |
| 916 | -0.615 | 0.99 | -0.375 |
| 917 | -0.61 | 0.991 | -0.381 |
| 918 | -0.605 | 0.992 | -0.386 |
| 919 | -0.601 | 0.993 | -0.392 |
| 920 | -0.596 | 0.993 | -0.398 |
| 921 | -0.591 | 0.994 | -0.403 |
| 922 | -0.586 | 0.995 | -0.409 |
| 923 | -0.581 | 0.995 | -0.415 |
| 924 | -0.576 | 0.996 | -0.42 |
| 925 | -0.571 | 0.996 | -0.426 |
| 926 | -0.566 | 0.997 | -0.431 |
| 927 | -0.561 | 0.997 | -0.437 |
| 928 | -0.556 | 0.998 | -0.442 |
| 929 | -0.55 | 0.998 | -0.448 |
| 930 | -0.545 | 0.999 | -0.453 |
| 931 | -0.54 | 0.999 | -0.459 |
| 932 | -0.535 | 0.999 | -0.464 |
| 933 | -0.53 | 0.999 | -0.47 |
| 934 | -0.525 | 1 | -0.475 |
| 935 | -0.519 | 1 | -0.48 |
| 936 | -0.514 | 1 | -0.486 |
| 937 | -0.509 | 1 | -0.491 |
| 938 | -0.504 | 1 | -0.496 |
| 939 | -0.498 | 1 | -0.502 |
| 940 | -0.493 | 1 | -0.507 |
| 941 | -0.488 | 1 | -0.512 |
| 942 | -0.482 | 1 | -0.518 |
| 943 | -0.477 | 1 | -0.523 |
| 944 | -0.471 | 0.999 | -0.528 |
| 945 | -0.466 | 0.999 | -0.533 |
| 946 | -0.461 | 0.999 | -0.538 |
| 947 | -0.455 | 0.999 | -0.544 |
| 948 | -0.45 | 0.998 | -0.549 |
| 949 | -0.444 | 0.998 | -0.554 |
| 950 | -0.439 | 0.998 | -0.559 |
| 951 | -0.433 | 0.997 | -0.564 |
| 952 | -0.428 | 0.997 | -0.569 |
| 953 | -0.422 | 0.996 | -0.574 |
| 954 | -0.416 | 0.996 | -0.579 |
| 955 | -0.411 | 0.995 | -0.584 |
| 956 | -0.405 | 0.994 | -0.589 |
| 957 | -0.4 | 0.994 | -0.594 |
| 958 | -0.394 | 0.993 | -0.599 |
| 959 | -0.388 | 0.992 | -0.604 |
| 960 | -0.383 | 0.991 | -0.609 |
| 961 | -0.377 | 0.991 | -0.614 |
| 962 | -0.371 | 0.99 | -0.618 |
| 963 | -0.366 | 0.989 | -0.623 |
| 964 | -0.36 | 0.988 | -0.628 |
| 965 | -0.354 | 0.987 | -0.633 |
| 966 | -0.348 | 0.986 | -0.638 |
| 967 | -0.343 | 0.985 | -0.642 |
| 968 | -0.337 | 0.984 | -0.647 |
| 969 | -0.331 | 0.983 | -0.652 |
| 970 | -0.325 | 0.982 | -0.656 |
| 971 | -0.319 | 0.98 | -0.661 |
| 972 | -0.314 | 0.979 | -0.665 |
| 973 | -0.308 | 0.978 | -0.67 |
| 974 | -0.302 | 0.977 | -0.675 |
| 975 | -0.296 | 0.975 | -0.679 |
| 976 | -0.29 | 0.974 | -0.684 |
| 977 | -0.284 | 0.972 | -0.688 |
| 978 | -0.279 | 0.971 | -0.692 |
| 979 | -0.273 | 0.97 | -0.697 |
| 980 | -0.267 | 0.968 | -0.701 |
| 981 | -0.261 | 0.966 | -0.706 |
| 982 | -0.255 | 0.965 | -0.71 |
| 983 | -0.249 | 0.963 | -0.714 |
| 984 | -0.243 | 0.962 | -0.719 |
| 985 | -0.237 | 0.96 | -0.723 |
| 986 | -0.231 | 0.958 | -0.727 |
| 987 | -0.225 | 0.956 | -0.731 |
| 988 | -0.219 | 0.955 | -0.735 |
| 989 | -0.213 | 0.953 | -0.74 |
| 990 | -0.207 | 0.951 | -0.744 |
| 991 | -0.201 | 0.949 | -0.748 |
| 992 | -0.195 | 0.947 | -0.752 |
| 993 | -0.189 | 0.945 | -0.756 |
| 994 | -0.183 | 0.943 | -0.76 |
| 995 | -0.177 | 0.941 | -0.764 |
| 996 | -0.171 | 0.939 | -0.768 |
| 997 | -0.165 | 0.937 | -0.772 |
| 998 | -0.159 | 0.934 | -0.776 |
| 999 | -0.153 | 0.932 | -0.779 |
| 1000 | -0.147 | 0.93 | -0.783 |
| 1001 | -0.141 | 0.928 | -0.787 |
| 1002 | -0.135 | 0.925 | -0.791 |
| 1003 | -0.128 | 0.923 | -0.795 |
| 1004 | -0.122 | 0.921 | -0.798 |
| 1005 | -0.116 | 0.918 | -0.802 |
| 1006 | -0.11 | 0.916 | -0.806 |
| 1007 | -0.104 | 0.913 | -0.809 |
| 1008 | -0.098 | 0.911 | -0.813 |
| 1009 | -0.092 | 0.908 | -0.816 |
| 1010 | -0.086 | 0.906 | -0.82 |
| 1011 | -0.08 | 0.903 | -0.823 |
| 1012 | -0.074 | 0.9 | -0.827 |
| 1013 | -0.067 | 0.898 | -0.83 |
| 1014 | -0.061 | 0.895 | -0.834 |
| 1015 | -0.055 | 0.892 | -0.837 |
| 1016 | -0.049 | 0.889 | -0.84 |
| 1017 | -0.043 | 0.887 | -0.844 |
| 1018 | -0.037 | 0.884 | -0.847 |
| 1019 | -0.031 | 0.881 | -0.85 |
| 1020 | -0.025 | 0.878 | -0.853 |
| 1021 | -0.018 | 0.875 | -0.857 |
| 1022 | -0.012 | 0.872 | -0.86 |
| 1023 | -0.006 | 0.869 | -0.863 |